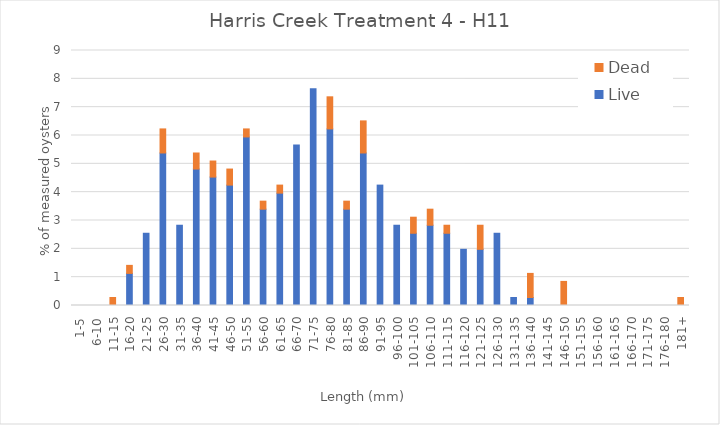
| Category | Live | Dead |
|---|---|---|
| 1-5 | 0 | 0 |
| 6-10 | 0 | 0 |
| 11-15 | 0 | 0.283 |
| 16-20 | 1.133 | 0.283 |
| 21-25 | 2.55 | 0 |
| 26-30 | 5.382 | 0.85 |
| 31-35 | 2.833 | 0 |
| 36-40 | 4.816 | 0.567 |
| 41-45 | 4.533 | 0.567 |
| 46-50 | 4.249 | 0.567 |
| 51-55 | 5.949 | 0.283 |
| 56-60 | 3.399 | 0.283 |
| 61-65 | 3.966 | 0.283 |
| 66-70 | 5.666 | 0 |
| 71-75 | 7.649 | 0 |
| 76-80 | 6.232 | 1.133 |
| 81-85 | 3.399 | 0.283 |
| 86-90 | 5.382 | 1.133 |
| 91-95 | 4.249 | 0 |
| 96-100 | 2.833 | 0 |
| 101-105 | 2.55 | 0.567 |
| 106-110 | 2.833 | 0.567 |
| 111-115 | 2.55 | 0.283 |
| 116-120 | 1.983 | 0 |
| 121-125 | 1.983 | 0.85 |
| 126-130 | 2.55 | 0 |
| 131-135 | 0.283 | 0 |
| 136-140 | 0.283 | 0.85 |
| 141-145 | 0 | 0 |
| 146-150 | 0 | 0.85 |
| 151-155 | 0 | 0 |
| 156-160 | 0 | 0 |
| 161-165 | 0 | 0 |
| 166-170 | 0 | 0 |
| 171-175 | 0 | 0 |
| 176-180 | 0 | 0 |
| 181+ | 0 | 0.283 |